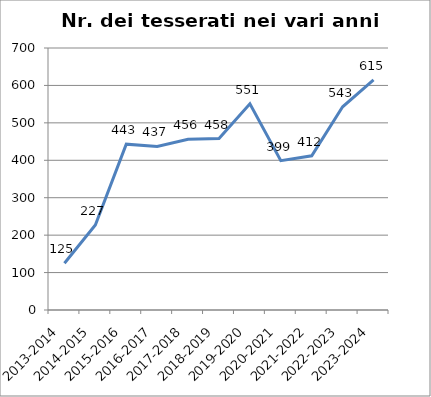
| Category | Nr. Tesserati |
|---|---|
| 2013-2014 | 125 |
| 2014-2015 | 227 |
| 2015-2016 | 443 |
| 2016-2017 | 437 |
| 2017-2018 | 456 |
| 2018-2019 | 458 |
| 2019-2020 | 551 |
| 2020-2021 | 399 |
| 2021-2022 | 412 |
| 2022-2023 | 543 |
| 2023-2024 | 615 |